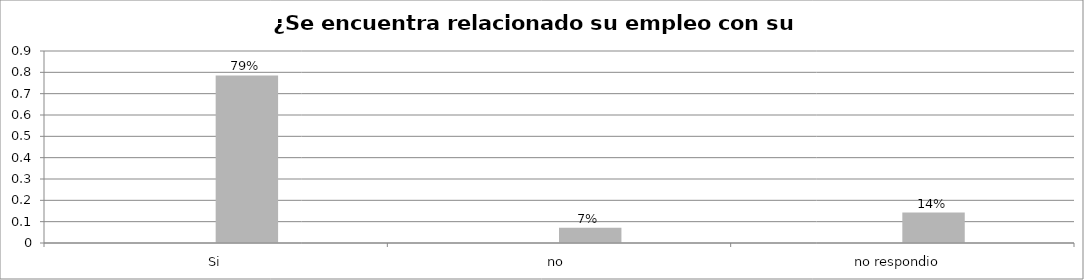
| Category | Series 0 | Series 1 | Series 2 | Series 3 |
|---|---|---|---|---|
| Si |  |  | 0.786 |  |
| no  |  |  | 0.071 |  |
| no respondio  |  |  | 0.143 |  |